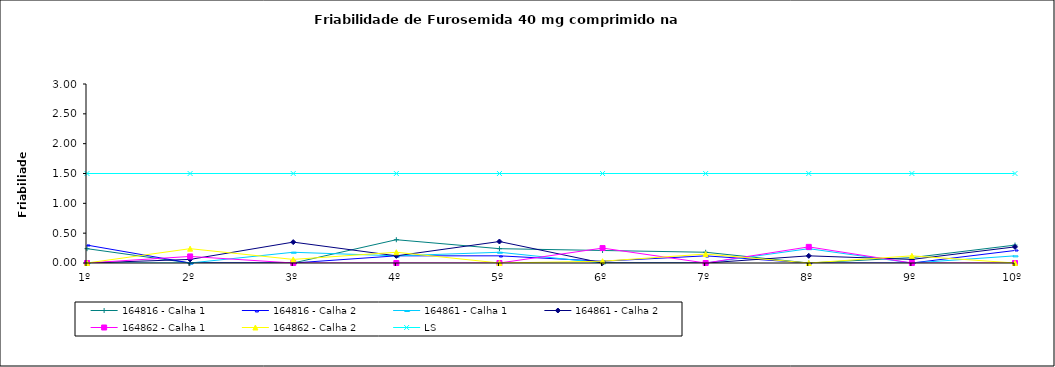
| Category | 164816 - Calha 1 | 164816 - Calha 2 | 164861 - Calha 1 | 164861 - Calha 2 | 164862 - Calha 1 | 164862 - Calha 2 | LS |
|---|---|---|---|---|---|---|---|
| 1º | 0.24 | 0.3 | 0 | 0 | 0 | 0 | 1.5 |
| 2º | 0 | 0 | 0 | 0.06 | 0.11 | 0.24 | 1.5 |
| 3º | 0 | 0 | 0.18 | 0.35 | 0 | 0.06 | 1.5 |
| 4º | 0.39 | 0.12 | 0.12 | 0.12 | 0 | 0.18 | 1.5 |
| 5º | 0.24 | 0.12 | 0.18 | 0.36 | 0 | 0 | 1.5 |
| 6º | 0.21 | 0.03 | 0 | 0 | 0.25 | 0.03 | 1.5 |
| 7º | 0.18 | 0.12 | 0 | 0 | 0 | 0.15 | 1.5 |
| 8º | 0 | 0 | 0.24 | 0.12 | 0.27 | 0 | 1.5 |
| 9º | 0.09 | 0 | 0 | 0.06 | 0 | 0.12 | 1.5 |
| 10º | 0.3 | 0.21 | 0.12 | 0.27 | 0 | 0 | 1.5 |